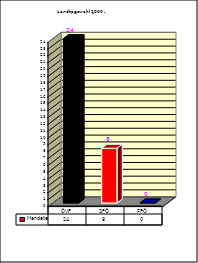
| Category | Mandate |
|---|---|
| ÖVP | 24 |
| SPÖ | 8 |
| FPÖ | 0 |